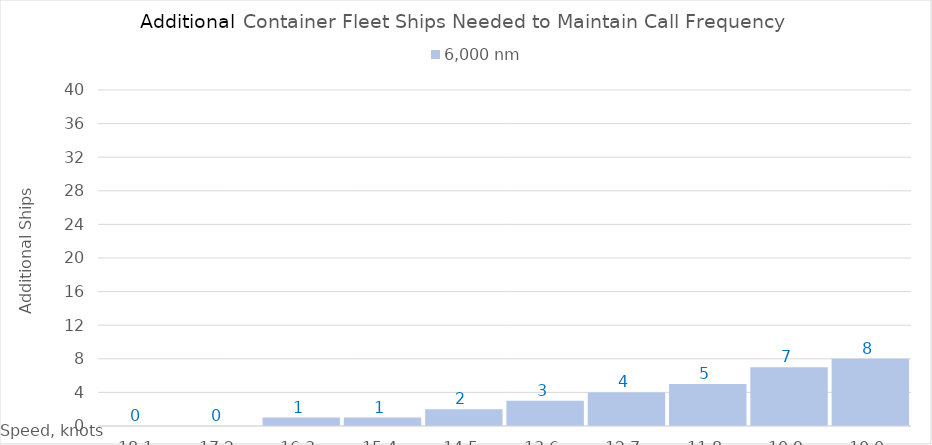
| Category | 6,000 |
|---|---|
| 18.1 | 0 |
| 17.200000000000003 | 0 |
| 16.300000000000004 | 1 |
| 15.400000000000004 | 1 |
| 14.500000000000004 | 2 |
| 13.600000000000003 | 3 |
| 12.700000000000003 | 4 |
| 11.800000000000002 | 5 |
| 10.900000000000002 | 7 |
| 10.000000000000002 | 8 |